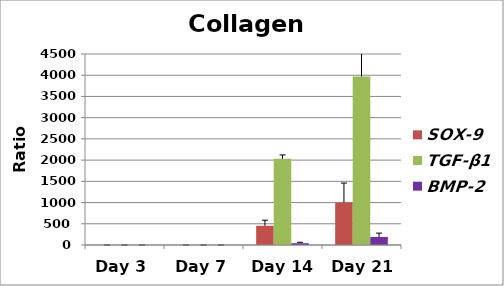
| Category | SOX-9 | TGF-β1 | BMP-2 |
|---|---|---|---|
| Day 3 | 0 | 0.001 | 0.063 |
| Day 7 | 0.069 | 0.201 | 0.057 |
| Day 14 | 452.308 | 2030.537 | 42.303 |
| Day 21 | 1000.941 | 3969.101 | 189.239 |